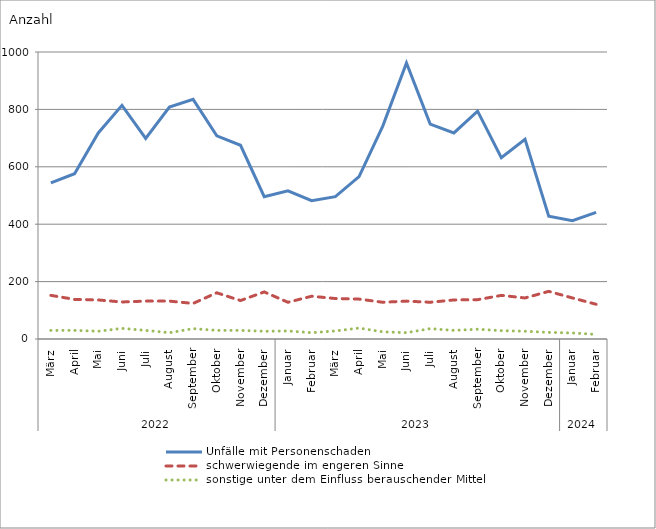
| Category | Unfälle mit Personenschaden | schwerwiegende im engeren Sinne | sonstige unter dem Einfluss berauschender Mittel |
|---|---|---|---|
| 0 | 544 | 152 | 30 |
| 1 | 576 | 138 | 30 |
| 2 | 718 | 136 | 27 |
| 3 | 814 | 129 | 37 |
| 4 | 699 | 132 | 30 |
| 5 | 808 | 132 | 22 |
| 6 | 835 | 124 | 36 |
| 7 | 708 | 161 | 30 |
| 8 | 675 | 134 | 30 |
| 9 | 496 | 164 | 27 |
| 10 | 516 | 128 | 28 |
| 11 | 482 | 149 | 22 |
| 12 | 496 | 141 | 28 |
| 13 | 566 | 139 | 38 |
| 14 | 742 | 128 | 25 |
| 15 | 962 | 132 | 22 |
| 16 | 749 | 128 | 36 |
| 17 | 718 | 136 | 30 |
| 18 | 794 | 137 | 34 |
| 19 | 632 | 152 | 29 |
| 20 | 696 | 143 | 27 |
| 21 | 428 | 166 | 23 |
| 22 | 412 | 143 | 21 |
| 23 | 441 | 121 | 16 |